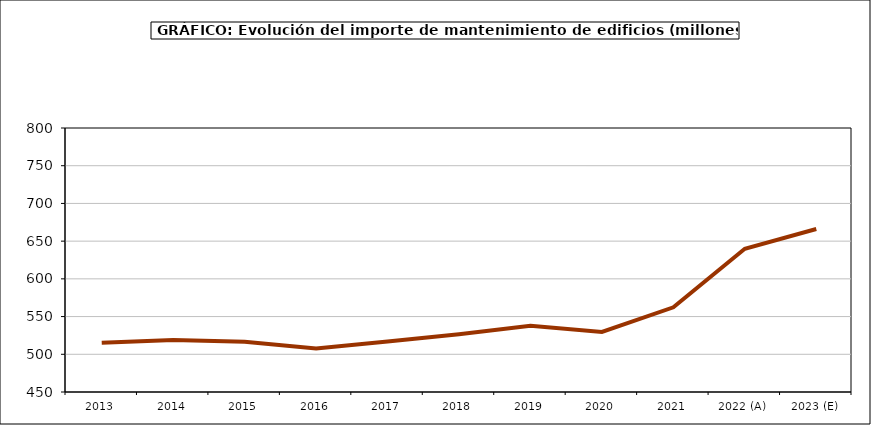
| Category | mantenimiento |
|---|---|
| 2013 | 515.387 |
| 2014 | 518.885 |
| 2015 | 516.507 |
| 2016 | 507.665 |
| 2017 | 516.979 |
| 2018 | 526.443 |
| 2019 | 537.976 |
| 2020 | 529.672 |
| 2021 | 562.29 |
| 2022 (A) | 639.965 |
| 2023 (E) | 666.037 |